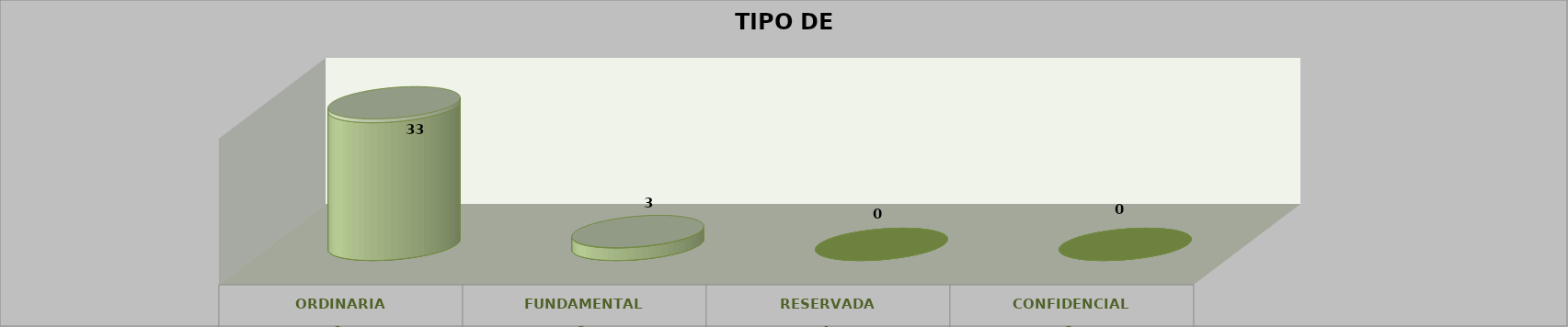
| Category | Series 0 | Series 2 | Series 1 | Series 3 | Series 4 |
|---|---|---|---|---|---|
| 0 |  |  |  | 33 | 0.917 |
| 1 |  |  |  | 3 | 0.083 |
| 2 |  |  |  | 0 | 0 |
| 3 |  |  |  | 0 | 0 |